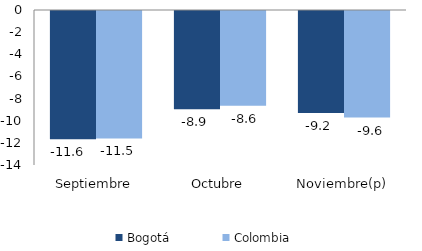
| Category | Bogotá | Colombia |
|---|---|---|
| Septiembre | -11.584 | -11.515 |
| Octubre | -8.882 | -8.551 |
| Noviembre(p) | -9.223 | -9.625 |